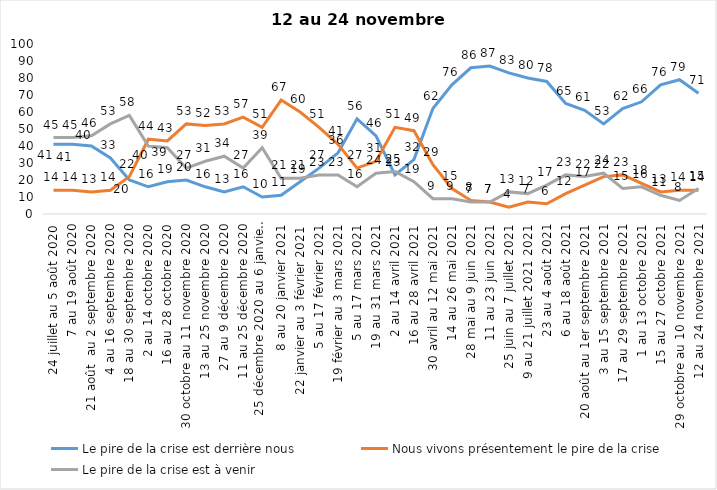
| Category | Le pire de la crise est derrière nous | Nous vivons présentement le pire de la crise | Le pire de la crise est à venir |
|---|---|---|---|
| 24 juillet au 5 août 2020 | 41 | 14 | 45 |
| 7 au 19 août 2020 | 41 | 14 | 45 |
| 21 août  au 2 septembre 2020 | 40 | 13 | 46 |
| 4 au 16 septembre 2020 | 33 | 14 | 53 |
| 18 au 30 septembre 2020 | 20 | 22 | 58 |
| 2 au 14 octobre 2020 | 16 | 44 | 40 |
| 16 au 28 octobre 2020 | 19 | 43 | 39 |
| 30 octobre au 11 novembre 2020 | 20 | 53 | 27 |
| 13 au 25 novembre 2020 | 16 | 52 | 31 |
| 27 au 9 décembre 2020 | 13 | 53 | 34 |
| 11 au 25 décembre 2020 | 16 | 57 | 27 |
| 25 décembre 2020 au 6 janvier 2021 | 10 | 51 | 39 |
| 8 au 20 janvier 2021 | 11 | 67 | 21 |
| 22 janvier au 3 février 2021 | 19 | 60 | 21 |
| 5 au 17 février 2021 | 27 | 51 | 23 |
| 19 février au 3 mars 2021 | 36 | 41 | 23 |
| 5 au 17 mars 2021 | 56 | 27 | 16 |
| 19 au 31 mars 2021 | 46 | 31 | 24 |
| 2 au 14 avril 2021 | 23 | 51 | 25 |
| 16 au 28 avril 2021 | 32 | 49 | 19 |
| 30 avril au 12 mai 2021 | 62 | 29 | 9 |
| 14 au 26 mai 2021 | 76 | 15 | 9 |
| 28 mai au 9 juin 2021 | 86 | 8 | 7 |
| 11 au 23 juin 2021 | 87 | 7 | 7 |
| 25 juin au 7 juillet 2021 | 83 | 4 | 13 |
| 9 au 21 juillet 2021 2021 | 80 | 7 | 12 |
| 23 au 4 août 2021 | 78 | 6 | 17 |
| 6 au 18 août 2021 | 65 | 12 | 23 |
| 20 août au 1er septembre 2021 | 61 | 17 | 22 |
| 3 au 15 septembre 2021 | 53 | 22 | 24 |
| 17 au 29 septembre 2021 | 62 | 23 | 15 |
| 1 au 13 octobre 2021 | 66 | 18 | 16 |
| 15 au 27 octobre 2021 | 76 | 13 | 11 |
| 29 octobre au 10 novembre 2021 | 79 | 14 | 8 |
| 12 au 24 novembre 2021 | 71 | 14 | 15 |